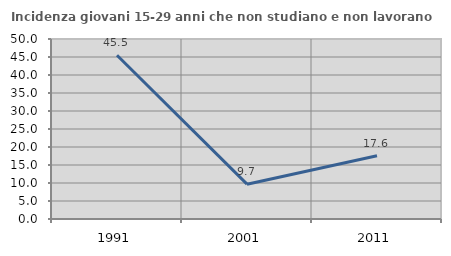
| Category | Incidenza giovani 15-29 anni che non studiano e non lavorano  |
|---|---|
| 1991.0 | 45.491 |
| 2001.0 | 9.672 |
| 2011.0 | 17.591 |